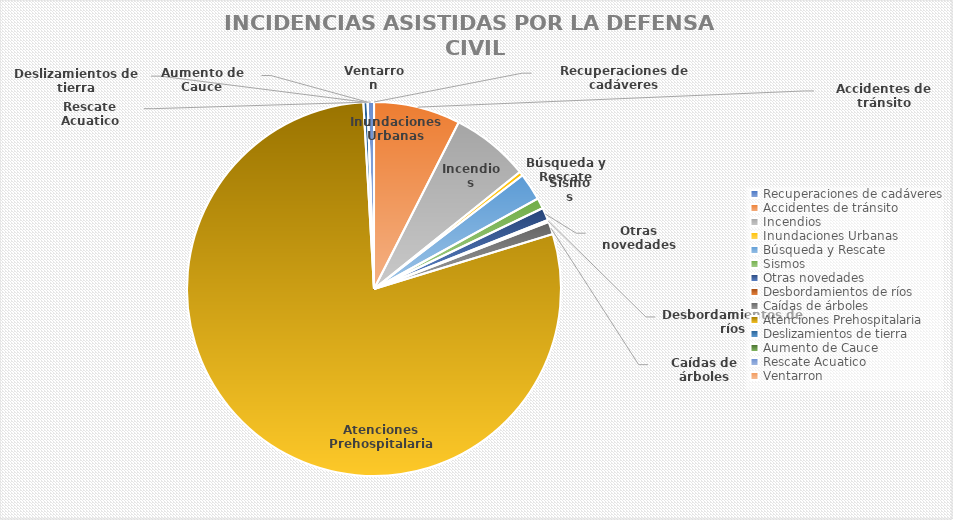
| Category | Series 0 |
|---|---|
| Recuperaciones de cadáveres | 0 |
| Accidentes de tránsito | 41 |
| Incendios | 37 |
| Inundaciones Urbanas | 2 |
| Búsqueda y Rescate | 13 |
| Sismos | 5 |
| Otras novedades | 6 |
| Desbordamientos de ríos | 1 |
| Caídas de árboles | 6 |
| Atenciones Prehospitalaria | 432 |
| Deslizamientos de tierra | 2 |
| Aumento de Cauce | 0 |
| Rescate Acuatico | 3 |
| Ventarron | 0 |